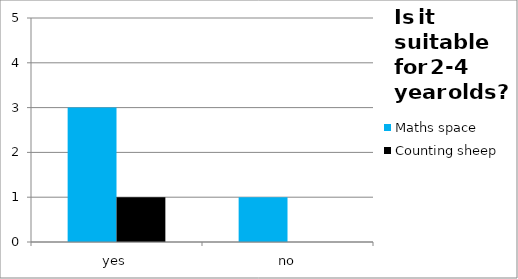
| Category | Maths space | Counting sheep |
|---|---|---|
| yes | 3 | 1 |
| no | 1 | 0 |